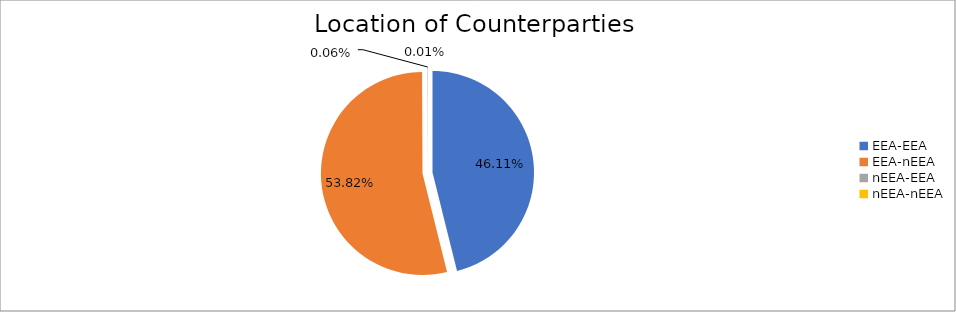
| Category | Series 0 |
|---|---|
| EEA-EEA | 5868688.199 |
| EEA-nEEA | 6849252.815 |
| nEEA-EEA | 7590.515 |
| nEEA-nEEA | 1645.326 |